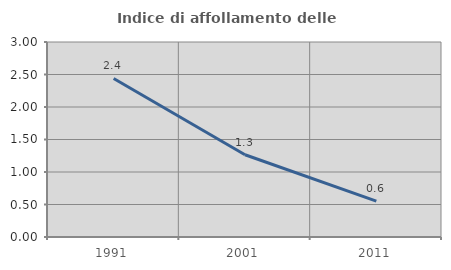
| Category | Indice di affollamento delle abitazioni  |
|---|---|
| 1991.0 | 2.439 |
| 2001.0 | 1.266 |
| 2011.0 | 0.552 |